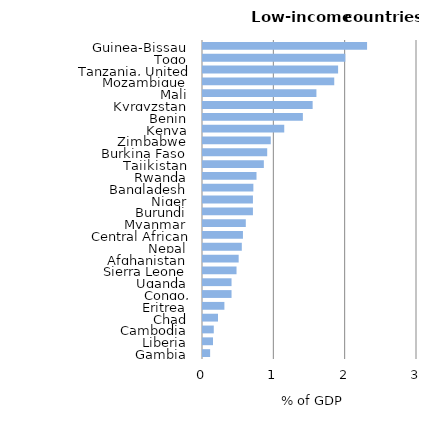
| Category | Series 0 |
|---|---|
| Gambia | 0.1 |
| Liberia | 0.14 |
| Cambodia | 0.151 |
| Chad | 0.21 |
| Eritrea | 0.3 |
| Congo, Democratic Rep. | 0.4 |
| Uganda | 0.4 |
| Sierra Leone | 0.47 |
| Afghanistan | 0.5 |
| Nepal | 0.544 |
| Central African Rep. | 0.56 |
| Myanmar | 0.6 |
| Burundi | 0.7 |
| Niger | 0.7 |
| Bangladesh | 0.706 |
| Rwanda | 0.75 |
| Tajikistan | 0.853 |
| Burkina Faso | 0.9 |
| Zimbabwe | 0.95 |
| Kenya | 1.139 |
| Benin | 1.4 |
| Kyrgyzstan | 1.537 |
| Mali | 1.59 |
| Mozambique | 1.84 |
| Tanzania, United Rep. | 1.894 |
| Togo | 1.995 |
| Guinea-Bissau | 2.3 |